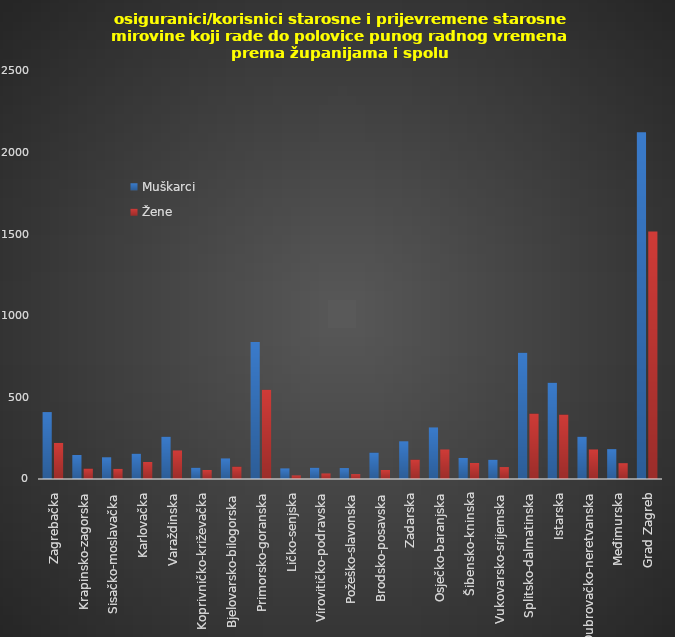
| Category | Muškarci | Žene |
|---|---|---|
| Zagrebačka | 410 | 221 |
| Krapinsko-zagorska | 147 | 64 |
| Sisačko-moslavačka | 133 | 62 |
| Karlovačka | 155 | 104 |
| Varaždinska | 259 | 175 |
| Koprivničko-križevačka | 69 | 55 |
| Bjelovarsko-bilogorska | 126 | 76 |
| Primorsko-goranska | 839 | 547 |
| Ličko-senjska | 65 | 22 |
| Virovitičko-podravska | 69 | 34 |
| Požeško-slavonska | 67 | 30 |
| Brodsko-posavska | 162 | 55 |
| Zadarska | 231 | 119 |
| Osječko-baranjska | 316 | 181 |
| Šibensko-kninska | 129 | 98 |
| Vukovarsko-srijemska | 118 | 73 |
| Splitsko-dalmatinska | 773 | 401 |
| Istarska | 590 | 395 |
| Dubrovačko-neretvanska | 259 | 181 |
| Međimurska | 183 | 97 |
| Grad Zagreb | 2124 | 1517 |